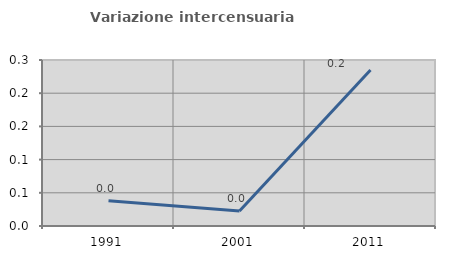
| Category | Variazione intercensuaria annua |
|---|---|
| 1991.0 | 0.038 |
| 2001.0 | 0.023 |
| 2011.0 | 0.235 |